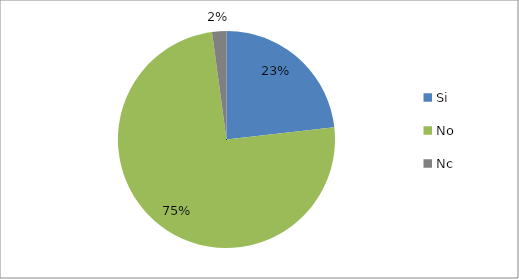
| Category | Series 0 | Series 1 | Series 2 |
|---|---|---|---|
| Si |  |  | 87 |
| No |  |  | 280 |
| Nc |  |  | 8 |